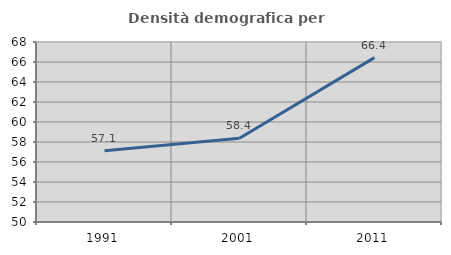
| Category | Densità demografica |
|---|---|
| 1991.0 | 57.134 |
| 2001.0 | 58.383 |
| 2011.0 | 66.439 |